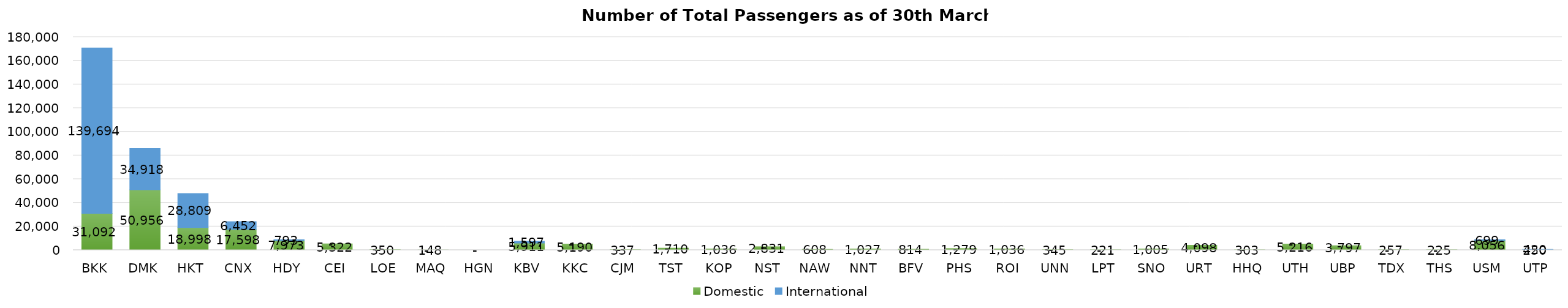
| Category | Domestic | International |
|---|---|---|
| BKK | 31092 | 139694 |
| DMK | 50956 | 34918 |
| HKT | 18998 | 28809 |
| CNX | 17598 | 6452 |
| HDY | 7973 | 793 |
| CEI | 5322 | 0 |
| LOE | 350 | 0 |
| MAQ | 148 | 0 |
| HGN | 0 | 0 |
| KBV | 5911 | 1597 |
| KKC | 5190 | 0 |
| CJM | 337 | 0 |
| TST | 1710 | 0 |
| KOP | 1036 | 0 |
| NST | 2831 | 0 |
| NAW | 608 | 0 |
| NNT | 1027 | 0 |
| BFV | 814 | 0 |
| PHS | 1279 | 0 |
| ROI | 1036 | 0 |
| UNN | 345 | 0 |
| LPT | 221 | 0 |
| SNO | 1005 | 0 |
| URT | 4098 | 0 |
| HHQ | 303 | 0 |
| UTH | 5216 | 0 |
| UBP | 3797 | 0 |
| TDX | 257 | 0 |
| THS | 225 | 0 |
| USM | 8056 | 699 |
| UTP | 250 | 420 |